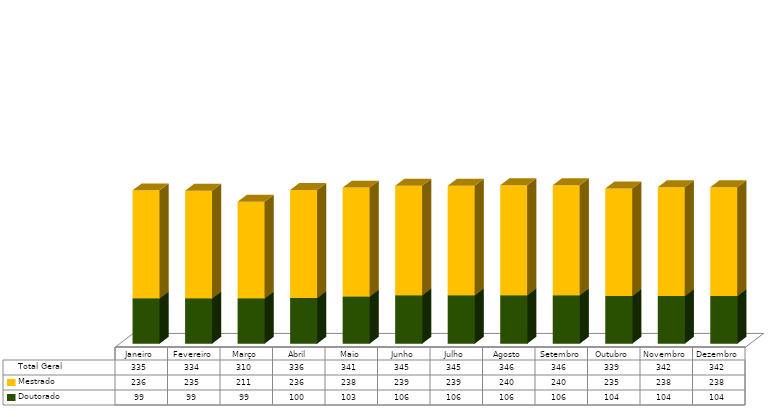
| Category | Doutorado                      | Mestrado                       | Total Geral |
|---|---|---|---|
| Janeiro | 99 | 236 | 335 |
| Fevereiro | 99 | 235 | 334 |
| Março | 99 | 211 | 310 |
| Abril | 100 | 236 | 336 |
| Maio | 103 | 238 | 341 |
| Junho | 106 | 239 | 345 |
| Julho | 106 | 239 | 345 |
| Agosto | 106 | 240 | 346 |
| Setembro | 106 | 240 | 346 |
| Outubro | 104 | 235 | 339 |
| Novembro | 104 | 238 | 342 |
| Dezembro | 104 | 238 | 342 |